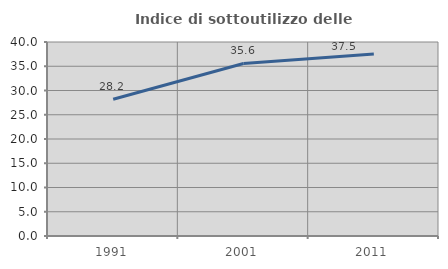
| Category | Indice di sottoutilizzo delle abitazioni  |
|---|---|
| 1991.0 | 28.198 |
| 2001.0 | 35.568 |
| 2011.0 | 37.549 |